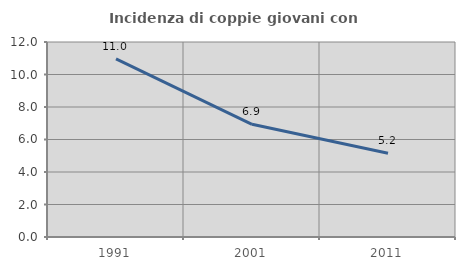
| Category | Incidenza di coppie giovani con figli |
|---|---|
| 1991.0 | 10.957 |
| 2001.0 | 6.933 |
| 2011.0 | 5.153 |